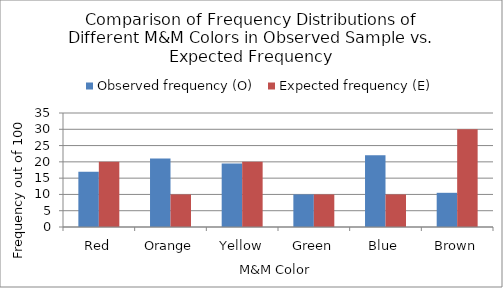
| Category | Observed frequency (O) | Expected frequency (E) |
|---|---|---|
| Red | 17 | 20 |
| Orange | 21 | 10 |
| Yellow | 19.5 | 20 |
| Green | 10 | 10 |
| Blue | 22 | 10 |
| Brown | 10.5 | 30 |